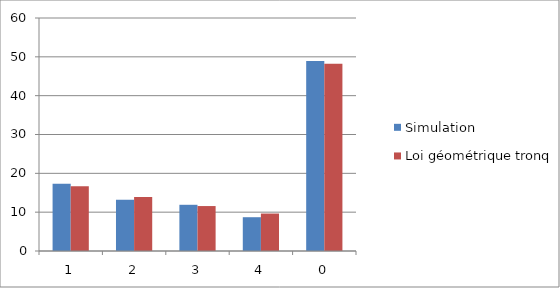
| Category | Simulation | Loi géométrique tronquée |
|---|---|---|
| 1.0 | 17.3 | 16.667 |
| 2.0 | 13.2 | 13.889 |
| 3.0 | 11.9 | 11.574 |
| 4.0 | 8.7 | 9.645 |
| 0.0 | 48.9 | 48.225 |